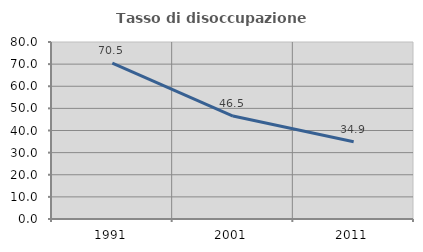
| Category | Tasso di disoccupazione giovanile  |
|---|---|
| 1991.0 | 70.455 |
| 2001.0 | 46.535 |
| 2011.0 | 34.906 |